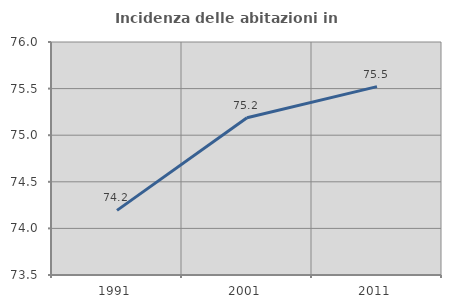
| Category | Incidenza delle abitazioni in proprietà  |
|---|---|
| 1991.0 | 74.194 |
| 2001.0 | 75.188 |
| 2011.0 | 75.521 |